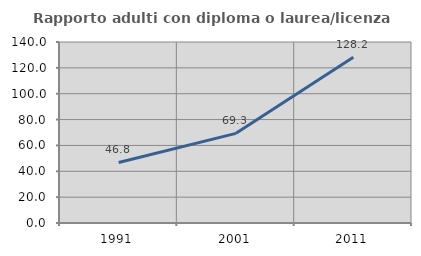
| Category | Rapporto adulti con diploma o laurea/licenza media  |
|---|---|
| 1991.0 | 46.809 |
| 2001.0 | 69.333 |
| 2011.0 | 128.205 |